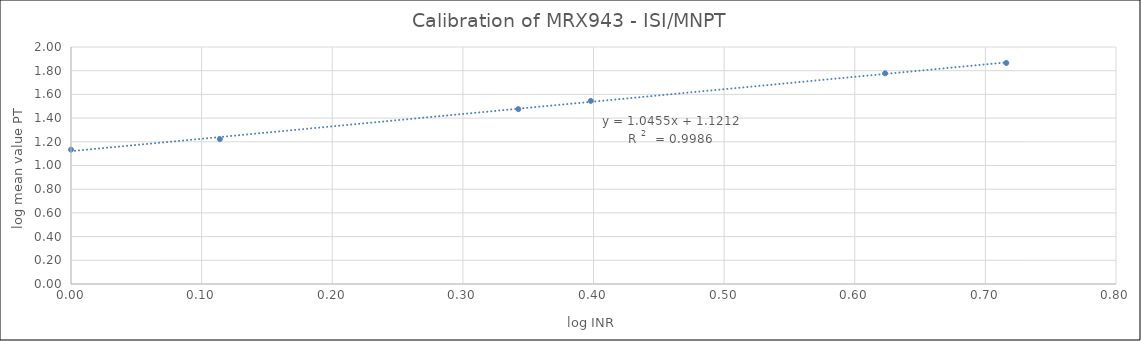
| Category | Kalibrering av PT Quick reagens |
|---|---|
| 0.0 | 1.134 |
| 0.11394335230683679 | 1.223 |
| 0.3424226808222063 | 1.476 |
| 0.3979400086720376 | 1.545 |
| 0.6232492903979004 | 1.778 |
| 0.7160033436347992 | 1.865 |